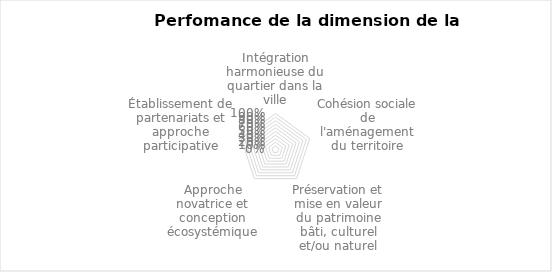
| Category | 0% |
|---|---|
| Intégration harmonieuse du quartier dans la ville | 0 |
| Cohésion sociale de l'aménagement du territoire | 0 |
| Préservation et mise en valeur du patrimoine bâti, culturel et/ou naturel | 0 |
| Approche novatrice et conception écosystémique | 0 |
| Établissement de partenariats et approche participative | 0 |